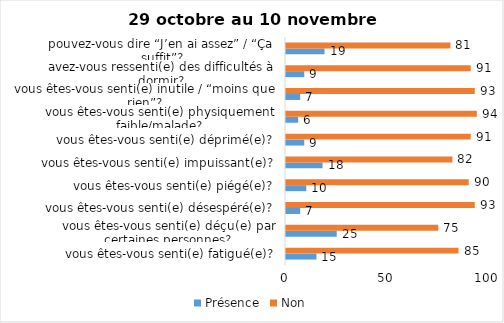
| Category | Présence | Non |
|---|---|---|
| vous êtes-vous senti(e) fatigué(e)? | 15 | 85 |
| vous êtes-vous senti(e) déçu(e) par certaines personnes? | 25 | 75 |
| vous êtes-vous senti(e) désespéré(e)? | 7 | 93 |
| vous êtes-vous senti(e) piégé(e)? | 10 | 90 |
| vous êtes-vous senti(e) impuissant(e)? | 18 | 82 |
| vous êtes-vous senti(e) déprimé(e)? | 9 | 91 |
| vous êtes-vous senti(e) physiquement faible/malade? | 6 | 94 |
| vous êtes-vous senti(e) inutile / “moins que rien”? | 7 | 93 |
| avez-vous ressenti(e) des difficultés à dormir? | 9 | 91 |
| pouvez-vous dire “J’en ai assez” / “Ça suffit”? | 19 | 81 |